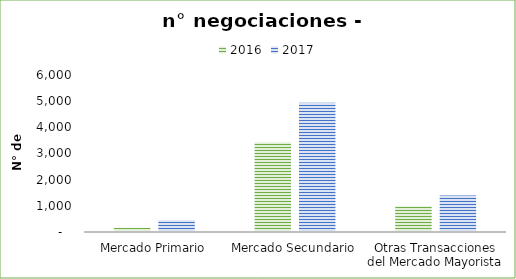
| Category | 2016 | 2017 |
|---|---|---|
| Mercado Primario | 159 | 448 |
| Mercado Secundario | 3430 | 4943 |
| Otras Transacciones del Mercado Mayorista | 982 | 1392 |